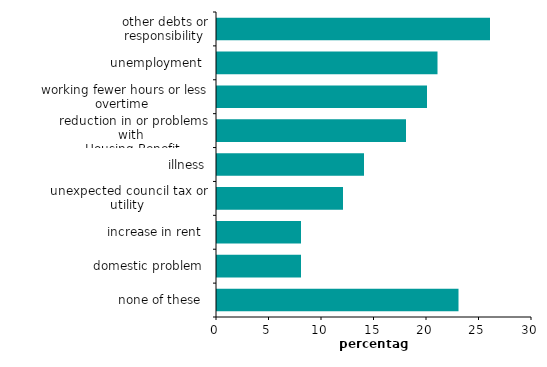
| Category | Series 0 |
|---|---|
| other debts or responsibility | 26 |
| unemployment  | 21 |
| working fewer hours or less overtime  | 20 |
| reduction in or problems with 
Housing Benefit | 18 |
| illness | 14 |
| unexpected council tax or utility  | 12 |
| increase in rent  | 8 |
| domestic problem  | 8 |
| none of these  | 23 |